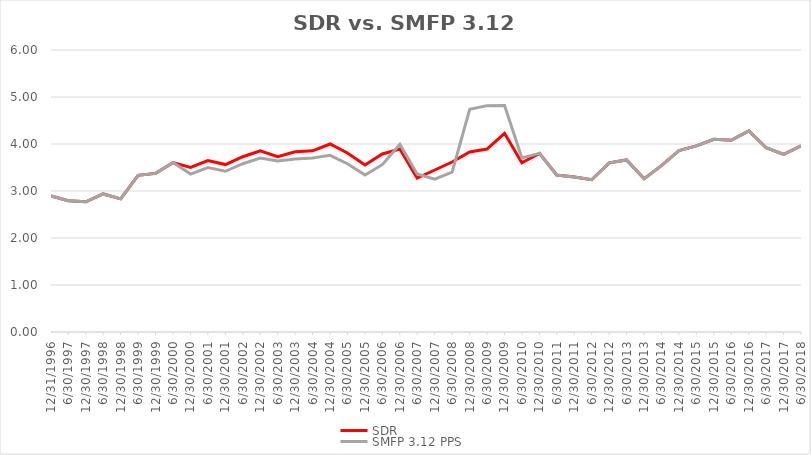
| Category | SDR | SMFP 3.12 PPS |
|---|---|---|
| 12/31/96 | 2.896 | 2.896 |
| 6/30/97 | 2.792 | 2.792 |
| 12/31/97 | 2.771 | 2.771 |
| 6/30/98 | 2.938 | 2.938 |
| 12/31/98 | 2.833 | 2.833 |
| 6/30/99 | 3.333 | 3.333 |
| 12/31/99 | 3.375 | 3.375 |
| 6/30/00 | 3.604 | 3.604 |
| 12/31/00 | 3.5 | 3.36 |
| 6/30/01 | 3.646 | 3.5 |
| 12/31/01 | 3.562 | 3.42 |
| 6/30/02 | 3.729 | 3.58 |
| 12/31/02 | 3.854 | 3.7 |
| 6/30/03 | 3.729 | 3.64 |
| 12/31/03 | 3.833 | 3.68 |
| 6/30/04 | 3.854 | 3.7 |
| 12/31/04 | 4 | 3.76 |
| 6/30/05 | 3.809 | 3.58 |
| 12/31/05 | 3.553 | 3.34 |
| 6/30/06 | 3.787 | 3.56 |
| 12/31/06 | 3.894 | 3.995 |
| 6/30/07 | 3.277 | 3.362 |
| 12/31/07 | 3.447 | 3.251 |
| 6/30/08 | 3.617 | 3.4 |
| 12/31/08 | 3.83 | 4.737 |
| 6/30/09 | 3.894 | 4.816 |
| 12/31/09 | 4.227 | 4.817 |
| 6/30/10 | 3.6 | 3.702 |
| 12/31/10 | 3.8 | 3.8 |
| 6/30/11 | 3.34 | 3.34 |
| 12/31/11 | 3.3 | 3.3 |
| 6/30/12 | 3.24 | 3.24 |
| 12/31/12 | 3.6 | 3.6 |
| 6/30/13 | 3.66 | 3.66 |
| 12/31/13 | 3.26 | 3.26 |
| 6/30/14 | 3.54 | 3.54 |
| 12/31/14 | 3.86 | 3.86 |
| 6/30/15 | 3.96 | 3.96 |
| 12/31/15 | 4.1 | 4.1 |
| 6/30/16 | 4.08 | 4.08 |
| 12/31/16 | 4.28 | 4.28 |
| 6/30/17 | 3.92 | 3.92 |
| 12/31/17 | 3.78 | 3.78 |
| 6/30/18 | 3.96 | 3.96 |